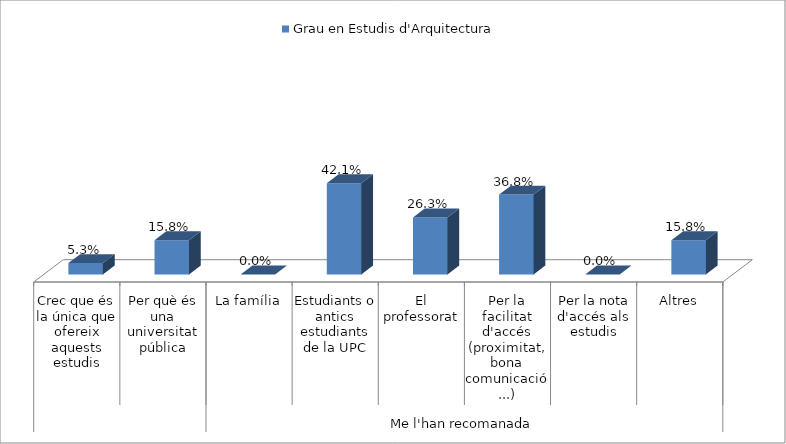
| Category | Grau en Estudis d'Arquitectura |
|---|---|
| 0 | 0.053 |
| 1 | 0.158 |
| 2 | 0 |
| 3 | 0.421 |
| 4 | 0.263 |
| 5 | 0.368 |
| 6 | 0 |
| 7 | 0.158 |